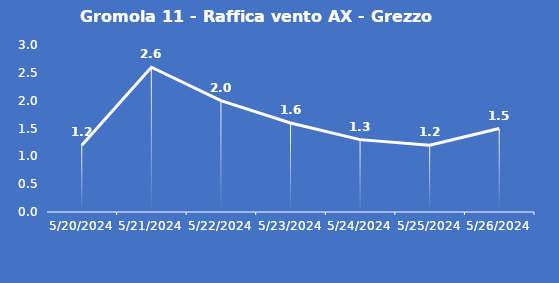
| Category | Gromola 11 - Raffica vento AX - Grezzo (m/s) |
|---|---|
| 5/20/24 | 1.2 |
| 5/21/24 | 2.6 |
| 5/22/24 | 2 |
| 5/23/24 | 1.6 |
| 5/24/24 | 1.3 |
| 5/25/24 | 1.2 |
| 5/26/24 | 1.5 |